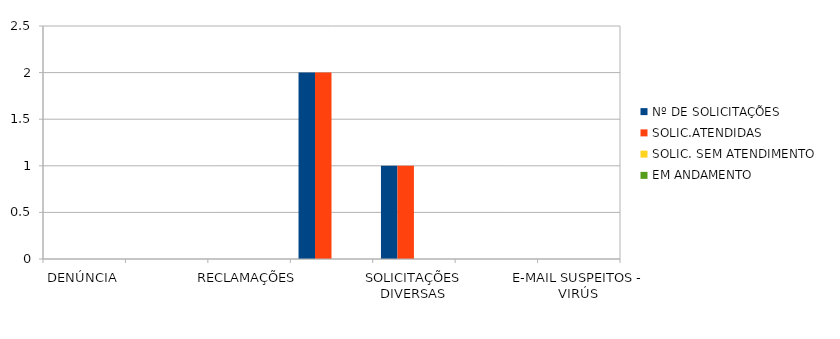
| Category | Nº DE SOLICITAÇÕES | SOLIC.ATENDIDAS | SOLIC. SEM ATENDIMENTO | EM ANDAMENTO |
|---|---|---|---|---|
| DENÚNCIA | 0 | 0 | 0 | 0 |
| DÚVIDA | 0 | 0 | 0 | 0 |
| RECLAMAÇÕES | 0 | 0 | 0 | 0 |
| PEDIDO DE ACESSO À INFORMAÇÃO | 2 | 2 | 0 | 0 |
| SOLICITAÇÕES DIVERSAS | 1 | 1 | 0 | 0 |
| SUGESTÃO  | 0 | 0 | 0 | 0 |
| E-MAIL SUSPEITOS - VIRÚS | 0 | 0 | 0 | 0 |